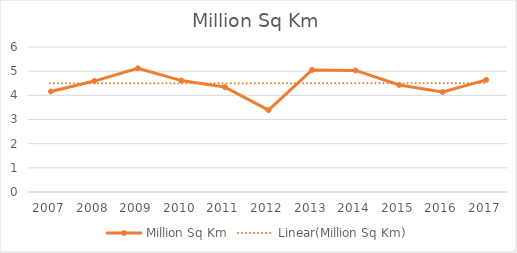
| Category | Million Sq Km |
|---|---|
| 2007.0 | 4.16 |
| 2008.0 | 4.59 |
| 2009.0 | 5.12 |
| 2010.0 | 4.61 |
| 2011.0 | 4.34 |
| 2012.0 | 3.39 |
| 2013.0 | 5.05 |
| 2014.0 | 5.03 |
| 2015.0 | 4.43 |
| 2016.0 | 4.14 |
| 2017.0 | 4.64 |